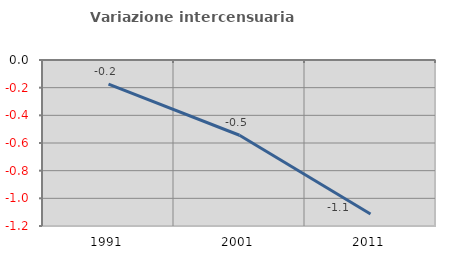
| Category | Variazione intercensuaria annua |
|---|---|
| 1991.0 | -0.175 |
| 2001.0 | -0.544 |
| 2011.0 | -1.113 |